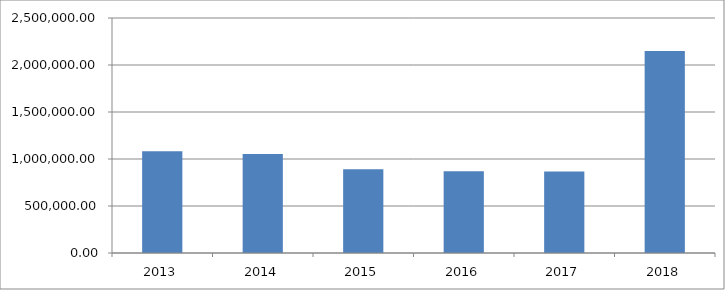
| Category | Series 0 |
|---|---|
| 2013.0 | 1083027.759 |
| 2014.0 | 1053564.854 |
| 2015.0 | 889633.659 |
| 2016.0 | 869592.077 |
| 2017.0 | 866775.07 |
| 2018.0 | 2147623.344 |